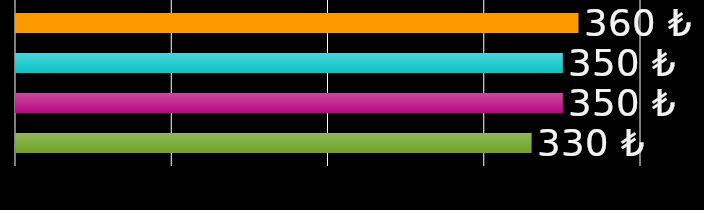
| Category | ev arkadaşı 1 | ev arkadaşı 2 | ev arkadaşı 3 | ev arkadaşı 4 |
|---|---|---|---|---|
| 0 | 360 | 350 | 350 | 330 |